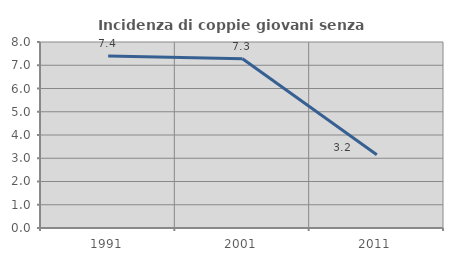
| Category | Incidenza di coppie giovani senza figli |
|---|---|
| 1991.0 | 7.395 |
| 2001.0 | 7.276 |
| 2011.0 | 3.151 |